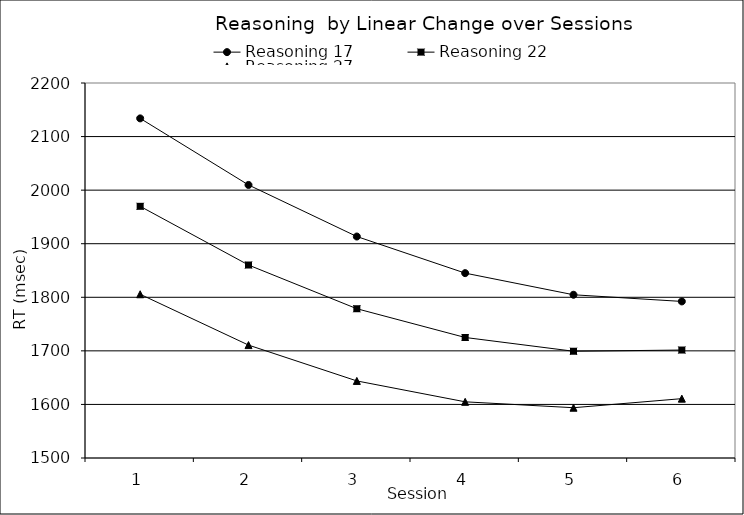
| Category | Reasoning 17 | Reasoning 22 | Reasoning 27 |
|---|---|---|---|
| 0 | 2133.942 | 1969.8 | 1805.658 |
| 1 | 2009.698 | 1860.237 | 1710.777 |
| 2 | 1913.409 | 1778.63 | 1643.851 |
| 3 | 1845.074 | 1724.977 | 1604.879 |
| 4 | 1804.694 | 1699.278 | 1593.862 |
| 5 | 1792.269 | 1701.535 | 1610.8 |